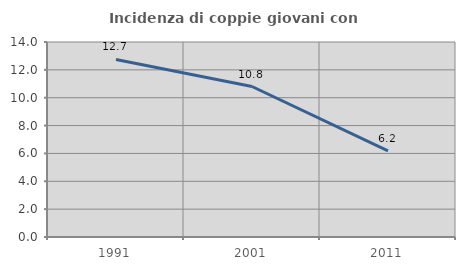
| Category | Incidenza di coppie giovani con figli |
|---|---|
| 1991.0 | 12.749 |
| 2001.0 | 10.805 |
| 2011.0 | 6.183 |